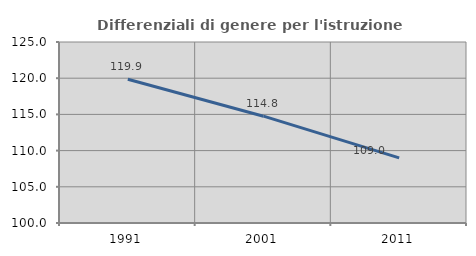
| Category | Differenziali di genere per l'istruzione superiore |
|---|---|
| 1991.0 | 119.862 |
| 2001.0 | 114.753 |
| 2011.0 | 109.003 |